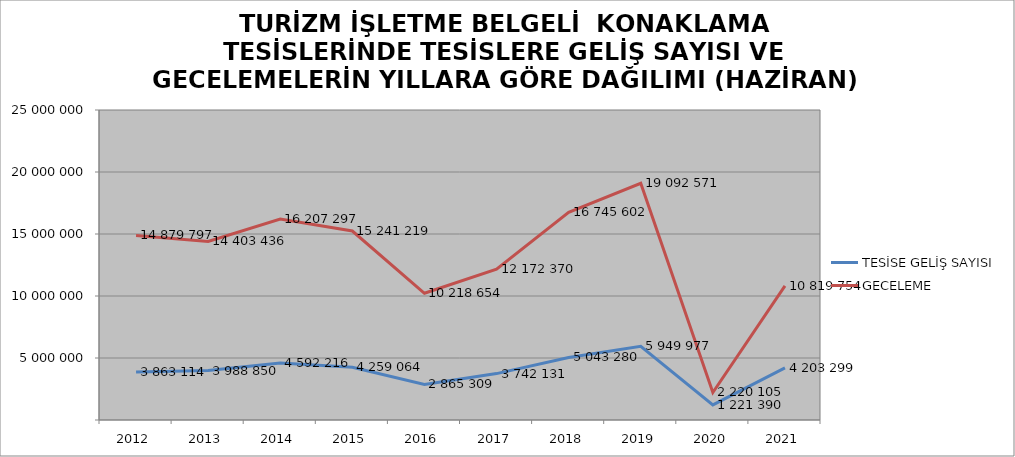
| Category | TESİSE GELİŞ SAYISI | GECELEME |
|---|---|---|
| 2012 | 3863114 | 14879797 |
| 2013 | 3988850 | 14403436 |
| 2014 | 4592216 | 16207297 |
| 2015 | 4259064 | 15241219 |
| 2016 | 2865309 | 10218654 |
| 2017 | 3742131 | 12172370 |
| 2018 | 5043280 | 16745602 |
| 2019 | 5949977 | 19092571 |
| 2020 | 1221390 | 2220105 |
| 2021 | 4203299 | 10819754 |